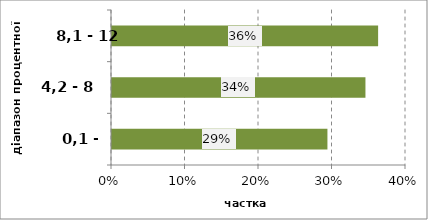
| Category | Series 0 |
|---|---|
| 0,1 - 4,1 | 0.293 |
| 4,2 - 8 | 0.345 |
| 8,1 - 12 | 0.362 |